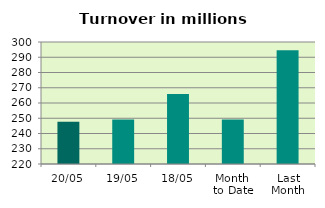
| Category | Series 0 |
|---|---|
| 20/05 | 247.666 |
| 19/05 | 249.109 |
| 18/05 | 265.971 |
| Month 
to Date | 249.136 |
| Last
Month | 294.539 |